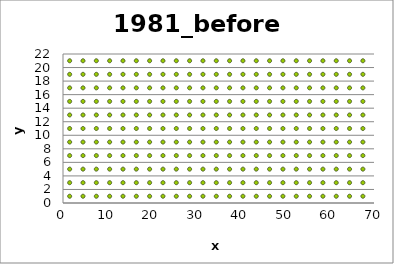
| Category | Series 0 |
|---|---|
| 1.5 | 1 |
| 4.5 | 1 |
| 7.5 | 1 |
| 10.5 | 1 |
| 13.5 | 1 |
| 16.5 | 1 |
| 19.5 | 1 |
| 22.5 | 1 |
| 25.5 | 1 |
| 28.5 | 1 |
| 31.5 | 1 |
| 34.5 | 1 |
| 37.5 | 1 |
| 40.5 | 1 |
| 43.5 | 1 |
| 46.5 | 1 |
| 49.5 | 1 |
| 52.5 | 1 |
| 55.5 | 1 |
| 58.5 | 1 |
| 61.5 | 1 |
| 64.5 | 1 |
| 67.5 | 1 |
| 70.5 | 1 |
| 70.5 | 3 |
| 67.5 | 3 |
| 64.5 | 3 |
| 61.5 | 3 |
| 58.5 | 3 |
| 55.5 | 3 |
| 52.5 | 3 |
| 49.5 | 3 |
| 46.5 | 3 |
| 43.5 | 3 |
| 40.5 | 3 |
| 37.5 | 3 |
| 34.5 | 3 |
| 31.5 | 3 |
| 28.5 | 3 |
| 25.5 | 3 |
| 22.5 | 3 |
| 19.5 | 3 |
| 16.5 | 3 |
| 13.5 | 3 |
| 10.5 | 3 |
| 7.5 | 3 |
| 4.5 | 3 |
| 1.5 | 3 |
| 1.5 | 5 |
| 4.5 | 5 |
| 7.5 | 5 |
| 10.5 | 5 |
| 13.5 | 5 |
| 16.5 | 5 |
| 19.5 | 5 |
| 22.5 | 5 |
| 25.5 | 5 |
| 28.5 | 5 |
| 31.5 | 5 |
| 34.5 | 5 |
| 37.5 | 5 |
| 40.5 | 5 |
| 43.5 | 5 |
| 46.5 | 5 |
| 49.5 | 5 |
| 52.5 | 5 |
| 55.5 | 5 |
| 58.5 | 5 |
| 61.5 | 5 |
| 64.5 | 5 |
| 67.5 | 5 |
| 70.5 | 5 |
| 70.5 | 7 |
| 67.5 | 7 |
| 64.5 | 7 |
| 61.5 | 7 |
| 58.5 | 7 |
| 55.5 | 7 |
| 52.5 | 7 |
| 49.5 | 7 |
| 46.5 | 7 |
| 43.5 | 7 |
| 40.5 | 7 |
| 37.5 | 7 |
| 34.5 | 7 |
| 31.5 | 7 |
| 28.5 | 7 |
| 25.5 | 7 |
| 22.5 | 7 |
| 19.5 | 7 |
| 16.5 | 7 |
| 13.5 | 7 |
| 10.5 | 7 |
| 7.5 | 7 |
| 4.5 | 7 |
| 1.5 | 7 |
| 1.5 | 9 |
| 4.5 | 9 |
| 7.5 | 9 |
| 10.5 | 9 |
| 13.5 | 9 |
| 16.5 | 9 |
| 19.5 | 9 |
| 22.5 | 9 |
| 25.5 | 9 |
| 28.5 | 9 |
| 31.5 | 9 |
| 34.5 | 9 |
| 37.5 | 9 |
| 40.5 | 9 |
| 43.5 | 9 |
| 46.5 | 9 |
| 49.5 | 9 |
| 52.5 | 9 |
| 55.5 | 9 |
| 58.5 | 9 |
| 61.5 | 9 |
| 64.5 | 9 |
| 67.5 | 9 |
| 70.5 | 9 |
| 70.5 | 11 |
| 67.5 | 11 |
| 64.5 | 11 |
| 61.5 | 11 |
| 58.5 | 11 |
| 55.5 | 11 |
| 52.5 | 11 |
| 49.5 | 11 |
| 46.5 | 11 |
| 43.5 | 11 |
| 40.5 | 11 |
| 37.5 | 11 |
| 34.5 | 11 |
| 31.5 | 11 |
| 28.5 | 11 |
| 25.5 | 11 |
| 22.5 | 11 |
| 19.5 | 11 |
| 16.5 | 11 |
| 13.5 | 11 |
| 10.5 | 11 |
| 7.5 | 11 |
| 4.5 | 11 |
| 1.5 | 11 |
| 1.5 | 13 |
| 4.5 | 13 |
| 7.5 | 13 |
| 10.5 | 13 |
| 13.5 | 13 |
| 16.5 | 13 |
| 19.5 | 13 |
| 22.5 | 13 |
| 25.5 | 13 |
| 28.5 | 13 |
| 31.5 | 13 |
| 34.5 | 13 |
| 37.5 | 13 |
| 40.5 | 13 |
| 43.5 | 13 |
| 46.5 | 13 |
| 49.5 | 13 |
| 52.5 | 13 |
| 55.5 | 13 |
| 58.5 | 13 |
| 61.5 | 13 |
| 64.5 | 13 |
| 67.5 | 13 |
| 70.5 | 13 |
| 70.5 | 15 |
| 67.5 | 15 |
| 64.5 | 15 |
| 61.5 | 15 |
| 58.5 | 15 |
| 55.5 | 15 |
| 52.5 | 15 |
| 49.5 | 15 |
| 46.5 | 15 |
| 43.5 | 15 |
| 40.5 | 15 |
| 37.5 | 15 |
| 34.5 | 15 |
| 31.5 | 15 |
| 28.5 | 15 |
| 25.5 | 15 |
| 22.5 | 15 |
| 19.5 | 15 |
| 16.5 | 15 |
| 13.5 | 15 |
| 10.5 | 15 |
| 7.5 | 15 |
| 4.5 | 15 |
| 1.5 | 15 |
| 1.5 | 17 |
| 4.5 | 17 |
| 7.5 | 17 |
| 10.5 | 17 |
| 13.5 | 17 |
| 16.5 | 17 |
| 19.5 | 17 |
| 22.5 | 17 |
| 25.5 | 17 |
| 28.5 | 17 |
| 31.5 | 17 |
| 34.5 | 17 |
| 37.5 | 17 |
| 40.5 | 17 |
| 43.5 | 17 |
| 46.5 | 17 |
| 49.5 | 17 |
| 52.5 | 17 |
| 55.5 | 17 |
| 58.5 | 17 |
| 61.5 | 17 |
| 64.5 | 17 |
| 67.5 | 17 |
| 70.5 | 17 |
| 70.5 | 19 |
| 67.5 | 19 |
| 64.5 | 19 |
| 61.5 | 19 |
| 58.5 | 19 |
| 55.5 | 19 |
| 52.5 | 19 |
| 49.5 | 19 |
| 46.5 | 19 |
| 43.5 | 19 |
| 40.5 | 19 |
| 37.5 | 19 |
| 34.5 | 19 |
| 31.5 | 19 |
| 28.5 | 19 |
| 25.5 | 19 |
| 22.5 | 19 |
| 19.5 | 19 |
| 16.5 | 19 |
| 13.5 | 19 |
| 10.5 | 19 |
| 7.5 | 19 |
| 4.5 | 19 |
| 1.5 | 19 |
| 1.5 | 21 |
| 4.5 | 21 |
| 7.5 | 21 |
| 10.5 | 21 |
| 13.5 | 21 |
| 16.5 | 21 |
| 19.5 | 21 |
| 22.5 | 21 |
| 25.5 | 21 |
| 28.5 | 21 |
| 31.5 | 21 |
| 34.5 | 21 |
| 37.5 | 21 |
| 40.5 | 21 |
| 43.5 | 21 |
| 46.5 | 21 |
| 49.5 | 21 |
| 52.5 | 21 |
| 55.5 | 21 |
| 58.5 | 21 |
| 61.5 | 21 |
| 64.5 | 21 |
| 67.5 | 21 |
| 70.5 | 21 |